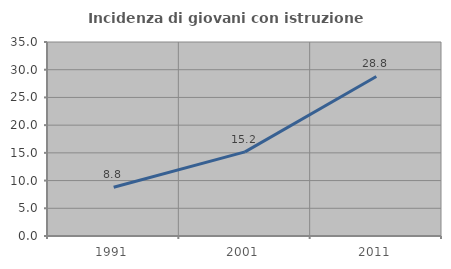
| Category | Incidenza di giovani con istruzione universitaria |
|---|---|
| 1991.0 | 8.796 |
| 2001.0 | 15.177 |
| 2011.0 | 28.787 |